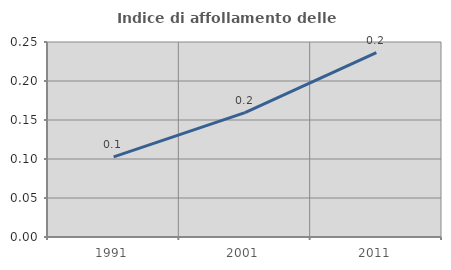
| Category | Indice di affollamento delle abitazioni  |
|---|---|
| 1991.0 | 0.103 |
| 2001.0 | 0.159 |
| 2011.0 | 0.236 |